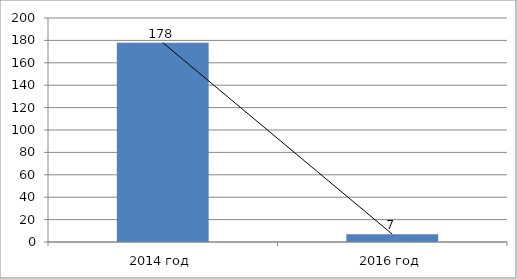
| Category | Series 0 |
|---|---|
| 2014 год | 178 |
| 2016 год | 7 |